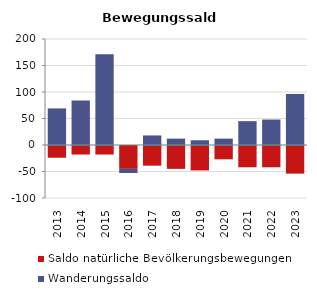
| Category | Saldo natürliche Bevölkerungsbewegungen | Wanderungssaldo |
|---|---|---|
| 2013.0 | -24 | 69 |
| 2014.0 | -18 | 84 |
| 2015.0 | -18 | 171 |
| 2016.0 | -45 | -6 |
| 2017.0 | -39 | 18 |
| 2018.0 | -45 | 12 |
| 2019.0 | -48 | 9 |
| 2020.0 | -27 | 12 |
| 2021.0 | -42 | 45 |
| 2022.0 | -42 | 48 |
| 2023.0 | -54 | 96 |